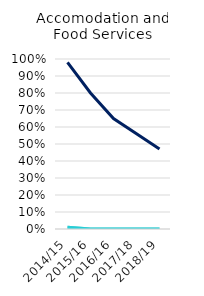
| Category | Employed | Self-Employed | Both |
|---|---|---|---|
| 2014/15 | 0.98 | 0.01 | 0.01 |
| 2015/16 | 0.8 | 0 | 0 |
| 2016/16 | 0.65 | 0 | 0 |
| 2017/18 | 0.56 | 0 | 0 |
| 2018/19 | 0.47 | 0 | 0 |